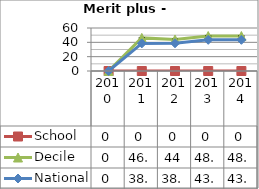
| Category | School  | Decile | National |
|---|---|---|---|
| 2010.0 | 0 | 0 | 0 |
| 2011.0 | 0 | 46.2 | 38.5 |
| 2012.0 | 0 | 44 | 38.7 |
| 2013.0 | 0 | 48.8 | 43.5 |
| 2014.0 | 0 | 48.8 | 43.5 |